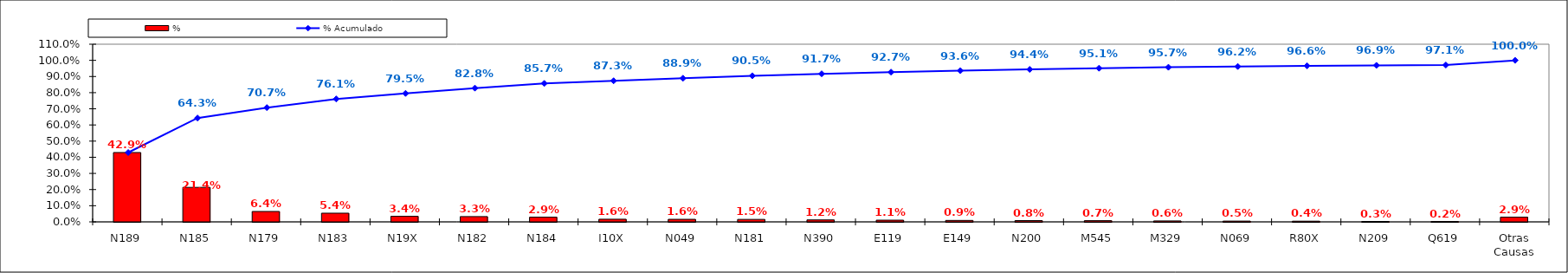
| Category | % |
|---|---|
| N189 | 0.429 |
| N185 | 0.214 |
| N179 | 0.064 |
| N183 | 0.054 |
| N19X | 0.034 |
| N182 | 0.033 |
| N184 | 0.029 |
| I10X | 0.016 |
| N049 | 0.016 |
| N181 | 0.015 |
| N390 | 0.012 |
| E119 | 0.011 |
| E149 | 0.009 |
| N200 | 0.008 |
| M545 | 0.007 |
| M329 | 0.006 |
| N069 | 0.005 |
| R80X | 0.004 |
| N209 | 0.003 |
| Q619 | 0.002 |
| Otras Causas | 0.029 |